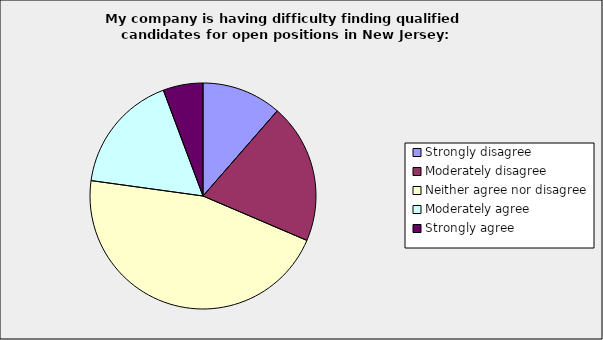
| Category | Series 0 |
|---|---|
| Strongly disagree | 0.114 |
| Moderately disagree | 0.2 |
| Neither agree nor disagree | 0.457 |
| Moderately agree | 0.171 |
| Strongly agree | 0.057 |